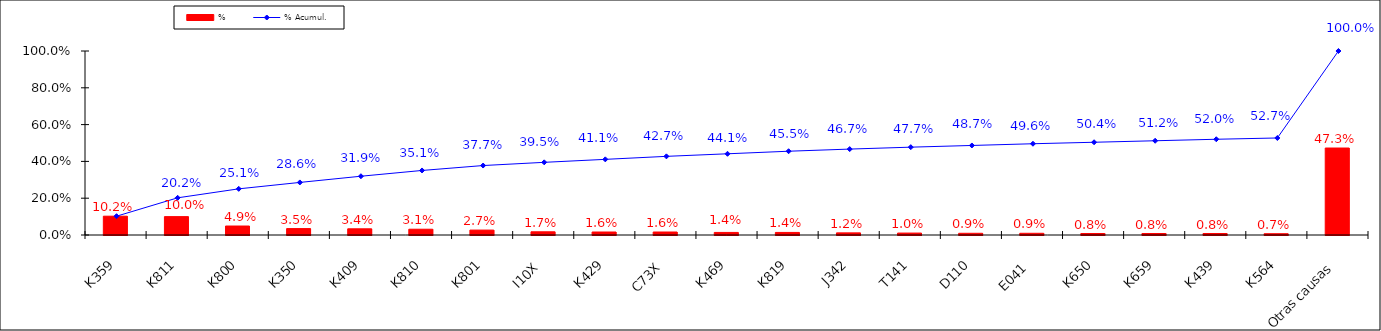
| Category | % |
|---|---|
| K359 | 0.102 |
| K811 | 0.1 |
| K800 | 0.049 |
| K350 | 0.035 |
| K409 | 0.034 |
| K810 | 0.031 |
| K801 | 0.027 |
| I10X | 0.017 |
| K429 | 0.016 |
| C73X | 0.016 |
| K469 | 0.014 |
| K819 | 0.014 |
| J342 | 0.012 |
| T141 | 0.01 |
| D110 | 0.009 |
| E041 | 0.009 |
| K650 | 0.008 |
| K659 | 0.008 |
| K439 | 0.008 |
| K564 | 0.007 |
| Otras causas | 0.473 |